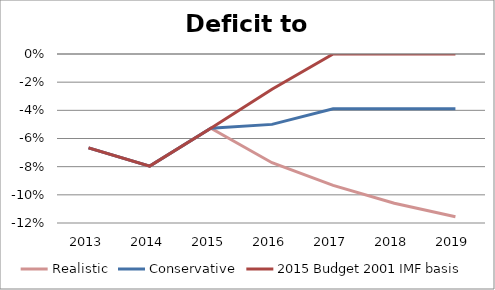
| Category | Realistic | Conservative | 2015 Budget 2001 IMF basis |
|---|---|---|---|
| 2013.0 | -0.067 | -0.067 | -0.067 |
| 2014.0 | -0.08 | -0.08 | -0.08 |
| 2015.0 | -0.053 | -0.053 | -0.053 |
| 2016.0 | -0.077 | -0.05 | -0.025 |
| 2017.0 | -0.093 | -0.039 | 0 |
| 2018.0 | -0.106 | -0.039 | 0 |
| 2019.0 | -0.116 | -0.039 | 0 |